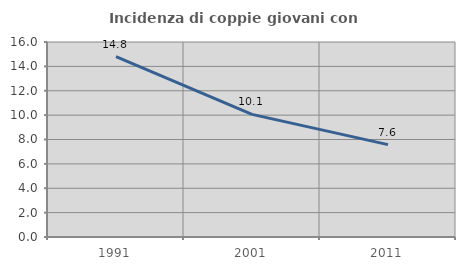
| Category | Incidenza di coppie giovani con figli |
|---|---|
| 1991.0 | 14.8 |
| 2001.0 | 10.062 |
| 2011.0 | 7.577 |